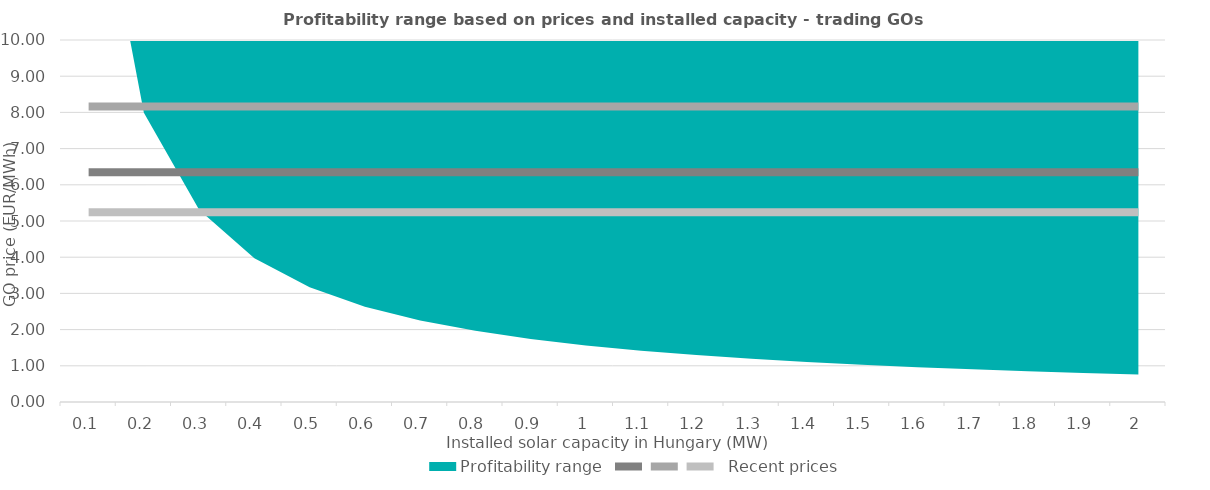
| Category | Series 2 | Series 3 |   Recent prices |
|---|---|---|---|
| 0.1 | 6.35 | 8.16 | 5.24 |
| 0.2 | 6.35 | 8.16 | 5.24 |
| 0.3 | 6.35 | 8.16 | 5.24 |
| 0.4 | 6.35 | 8.16 | 5.24 |
| 0.5 | 6.35 | 8.16 | 5.24 |
| 0.6 | 6.35 | 8.16 | 5.24 |
| 0.7 | 6.35 | 8.16 | 5.24 |
| 0.8 | 6.35 | 8.16 | 5.24 |
| 0.9 | 6.35 | 8.16 | 5.24 |
| 1.0 | 6.35 | 8.16 | 5.24 |
| 1.1 | 6.35 | 8.16 | 5.24 |
| 1.2 | 6.35 | 8.16 | 5.24 |
| 1.3 | 6.35 | 8.16 | 5.24 |
| 1.4 | 6.35 | 8.16 | 5.24 |
| 1.5 | 6.35 | 8.16 | 5.24 |
| 1.6 | 6.35 | 8.16 | 5.24 |
| 1.7 | 6.35 | 8.16 | 5.24 |
| 1.8 | 6.35 | 8.16 | 5.24 |
| 1.9 | 6.35 | 8.16 | 5.24 |
| 2.0 | 6.35 | 8.16 | 5.24 |